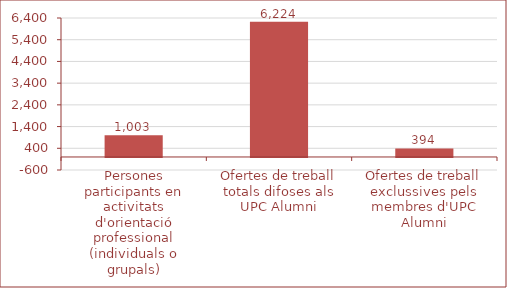
| Category | Series 0 |
|---|---|
| Persones participants en activitats d'orientació professional (individuals o grupals) | 1003 |
| Ofertes de treball totals difoses als UPC Alumni | 6224 |
| Ofertes de treball exclussives pels membres d'UPC Alumni | 394 |